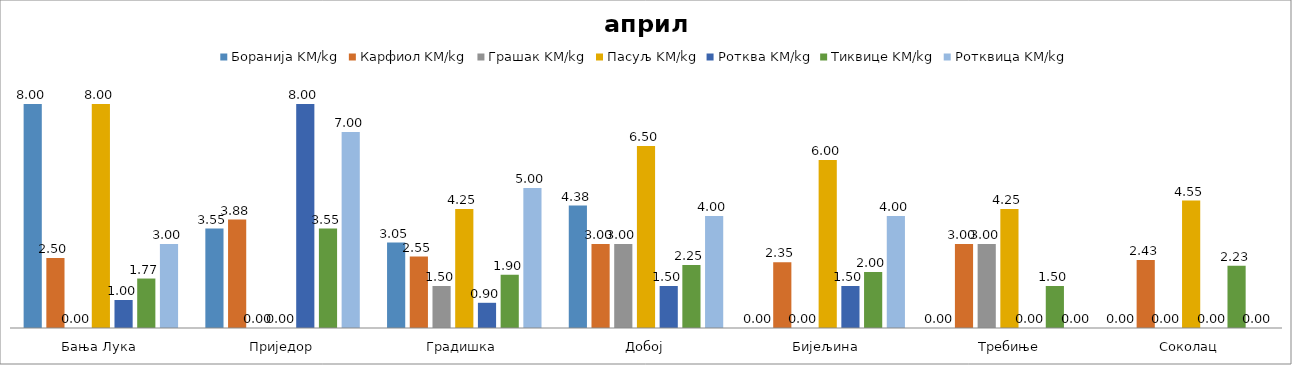
| Category | Боранија KM/kg | Карфиол KM/kg | Грашак KM/kg | Пасуљ KM/kg | Ротква KM/kg | Тиквице KM/kg | Ротквица KM/kg |
|---|---|---|---|---|---|---|---|
| Бања Лука | 8 | 2.5 | 0 | 8 | 1 | 1.767 | 3 |
| Приједор | 3.55 | 3.875 | 0 | 0 | 8 | 3.55 | 7 |
| Градишка | 3.05 | 2.55 | 1.5 | 4.25 | 0.9 | 1.9 | 5 |
| Добој | 4.375 | 3 | 3 | 6.5 | 1.5 | 2.25 | 4 |
| Бијељина | 0 | 2.35 | 0 | 6 | 1.5 | 2 | 4 |
|  Требиње | 0 | 3 | 3 | 4.25 | 0 | 1.5 | 0 |
| Соколац | 0 | 2.425 | 0 | 4.55 | 0 | 2.225 | 0 |